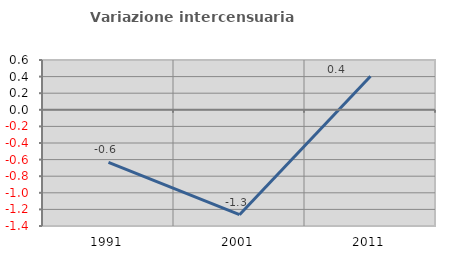
| Category | Variazione intercensuaria annua |
|---|---|
| 1991.0 | -0.634 |
| 2001.0 | -1.264 |
| 2011.0 | 0.405 |